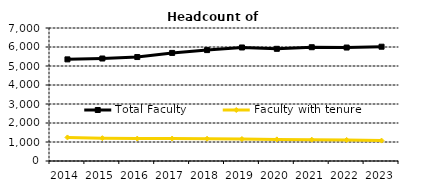
| Category | Total Faculty | Faculty with tenure |
|---|---|---|
| 2014.0 | 5349 | 1240 |
| 2015.0 | 5394 | 1201 |
| 2016.0 | 5472 | 1179 |
| 2017.0 | 5689 | 1181 |
| 2018.0 | 5837 | 1172 |
| 2019.0 | 5975 | 1156 |
| 2020.0 | 5904 | 1138 |
| 2021.0 | 5988 | 1123 |
| 2022.0 | 5972 | 1109 |
| 2023.0 | 6015 | 1074 |